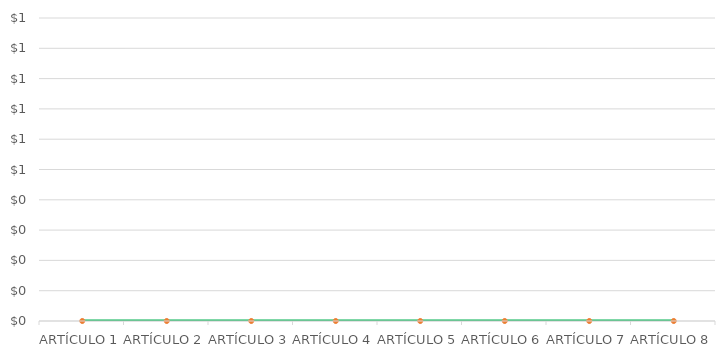
| Category | Series 1 |
|---|---|
| ARTÍCULO 1 | 0 |
| ARTÍCULO 2 | 0 |
| ARTÍCULO 3 | 0 |
| ARTÍCULO 4 | 0 |
| ARTÍCULO 5 | 0 |
| ARTÍCULO 6 | 0 |
| ARTÍCULO 7 | 0 |
| ARTÍCULO 8 | 0 |